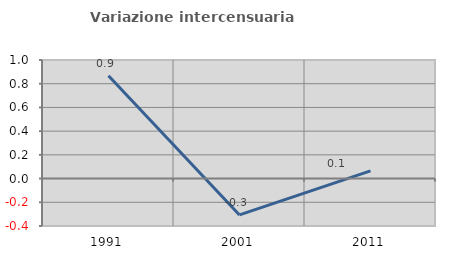
| Category | Variazione intercensuaria annua |
|---|---|
| 1991.0 | 0.867 |
| 2001.0 | -0.307 |
| 2011.0 | 0.065 |